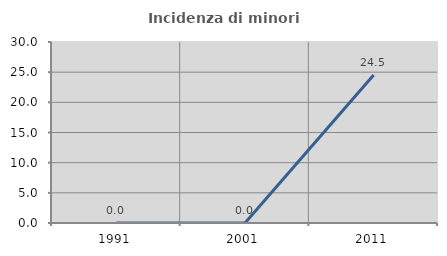
| Category | Incidenza di minori stranieri |
|---|---|
| 1991.0 | 0 |
| 2001.0 | 0 |
| 2011.0 | 24.528 |